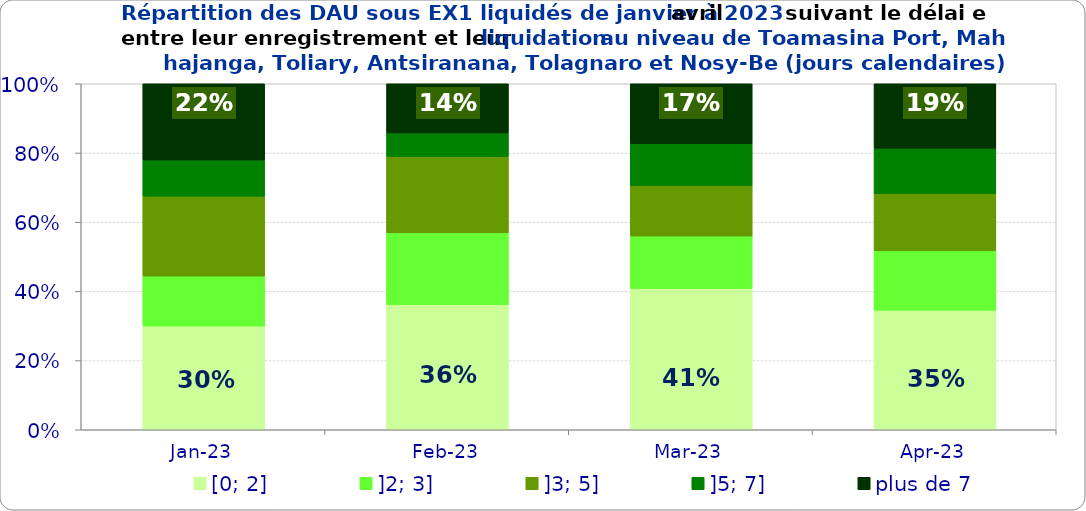
| Category | [0; 2] | ]2; 3] | ]3; 5] | ]5; 7] | plus de 7 |
|---|---|---|---|---|---|
| 2023-01-01 | 0.3 | 0.145 | 0.231 | 0.104 | 0.221 |
| 2023-02-01 | 0.362 | 0.208 | 0.221 | 0.068 | 0.142 |
| 2023-03-01 | 0.408 | 0.152 | 0.146 | 0.121 | 0.173 |
| 2023-04-01 | 0.345 | 0.172 | 0.165 | 0.131 | 0.186 |